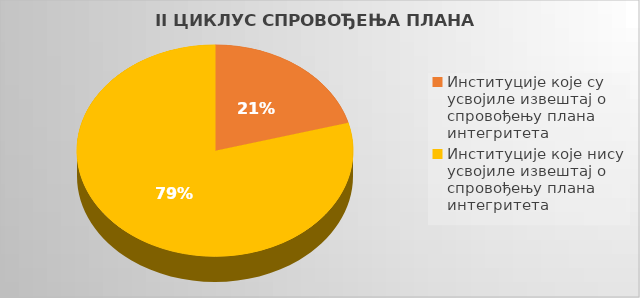
| Category | Series 0 |
|---|---|
| Институције које су усвојиле извештај о спровођењу плана интегритета | 0.207 |
| Институције које нису усвојиле извештај о спровођењу плана интегритета | 0.793 |